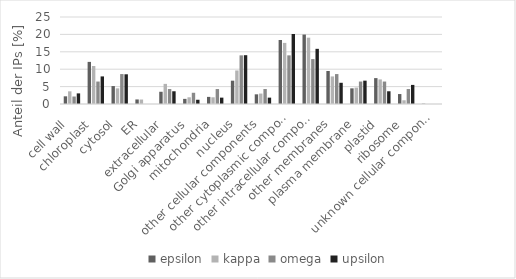
| Category | epsilon | kappa | omega | upsilon |
|---|---|---|---|---|
| cell wall  | 2.208 | 3.64 | 2.151 | 3.049 |
| chloroplast  | 12.101 | 10.921 | 6.452 | 7.927 |
| cytosol  | 5.151 | 4.497 | 8.602 | 8.537 |
| ER  | 1.308 | 1.285 | 0 | 0 |
| extracellular  | 3.516 | 5.782 | 4.301 | 3.659 |
| Golgi apparatus  | 1.472 | 1.927 | 3.226 | 1.22 |
| mitochondria  | 2.044 | 1.927 | 4.301 | 1.829 |
| nucleus  | 6.705 | 9.636 | 13.978 | 14.024 |
| other cellular components  | 2.78 | 2.998 | 4.301 | 1.829 |
| other cytoplasmic components  | 18.397 | 17.559 | 13.978 | 20.122 |
| other intracellular components  | 19.951 | 19.058 | 12.903 | 15.854 |
| other membranes  | 9.485 | 7.923 | 8.602 | 6.098 |
| plasma membrane  | 4.497 | 4.711 | 6.452 | 6.707 |
| plastid  | 7.441 | 7.066 | 6.452 | 3.659 |
| ribosome  | 2.862 | 1.071 | 4.301 | 5.488 |
| unknown cellular components  | 0.082 | 0 | 0 | 0 |